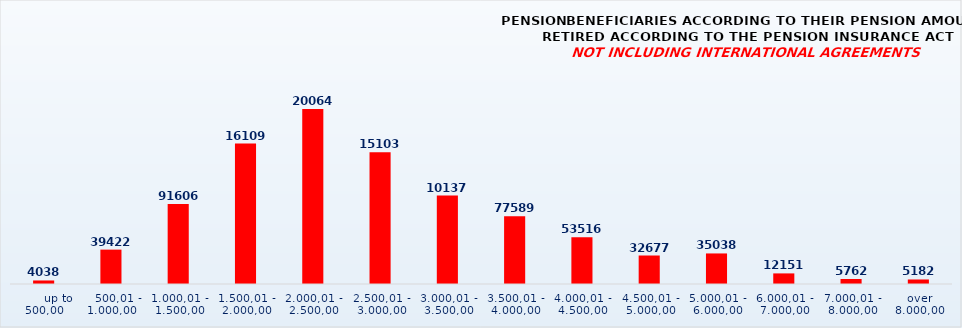
| Category | PENSION BENEFICIARIES ACCORDING TO TYPES AND AMOUNTS OF PENSION, RETIRED ACCORDING TO THE PENSION INSURANCE ACT
NOT INCLUDING INTERNATIONAL AGREEMENTS |
|---|---|
|       up to 500,00 | 4038 |
|    500,01 - 1.000,00 | 39422 |
| 1.000,01 - 1.500,00 | 91606 |
| 1.500,01 - 2.000,00 | 161099 |
| 2.000,01 - 2.500,00 | 200642 |
| 2.500,01 - 3.000,00 | 151033 |
| 3.000,01 - 3.500,00 | 101371 |
| 3.500,01 - 4.000,00 | 77589 |
| 4.000,01 - 4.500,00 | 53516 |
| 4.500,01 - 5.000,00 | 32677 |
| 5.000,01 - 6.000,00 | 35038 |
| 6.000,01 - 7.000,00 | 12151 |
| 7.000,01 - 8.000,00 | 5762 |
|  over  8.000,00 | 5182 |